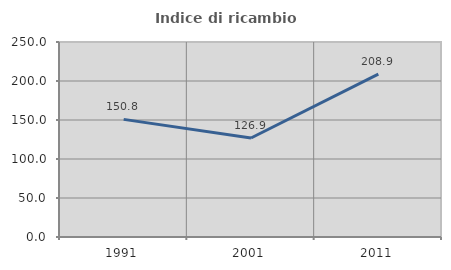
| Category | Indice di ricambio occupazionale  |
|---|---|
| 1991.0 | 150.82 |
| 2001.0 | 126.923 |
| 2011.0 | 208.889 |